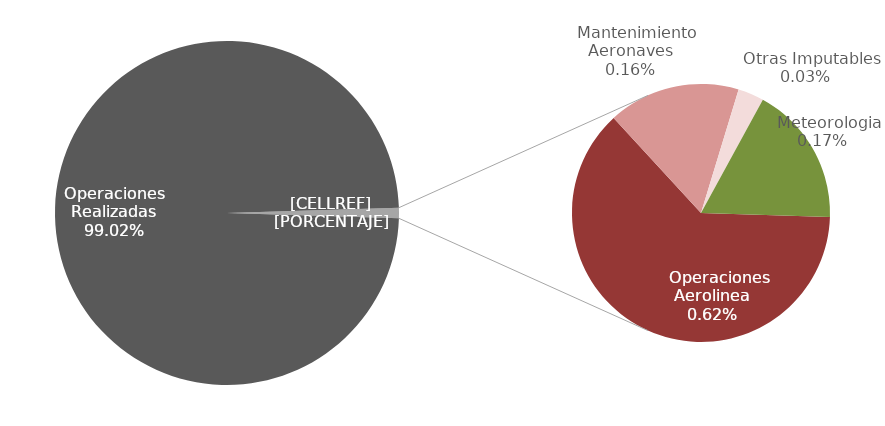
| Category | Series 0 |
|---|---|
| Operaciones Realizadas | 31011 |
|    Operaciones Aerolinea | 193 |
|    Mantenimiento Aeronaves | 51 |
|    Otras Imputables | 10 |
|    Meteorologia | 54 |
|    Otras No Imputables | 0 |